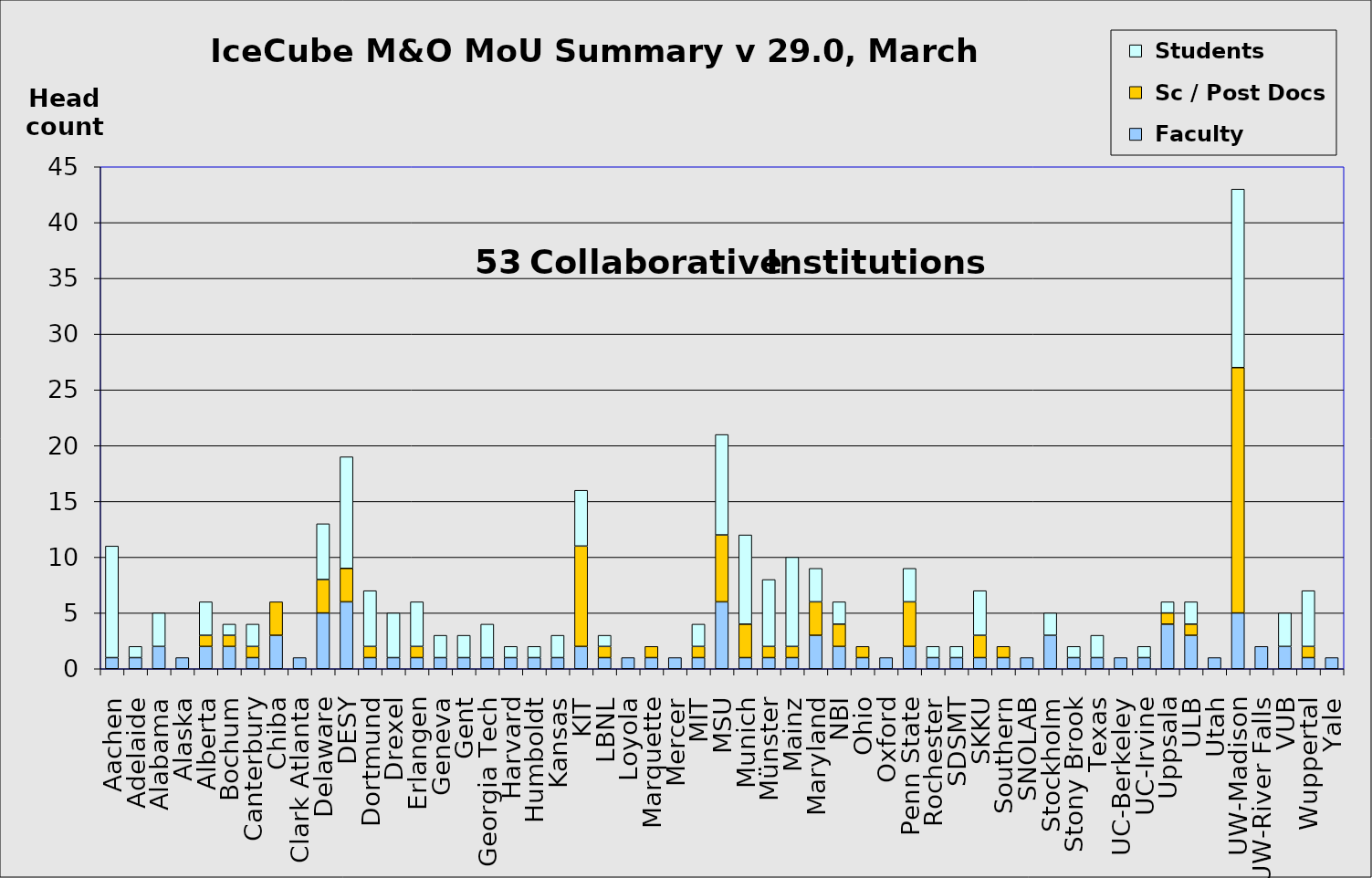
| Category |  Faculty |  Sc / Post Docs |  Students |
|---|---|---|---|
| Aachen | 1 | 0 | 10 |
| Adelaide | 1 | 0 | 1 |
| Alabama | 2 | 0 | 3 |
| Alaska | 1 | 0 | 0 |
| Alberta | 2 | 1 | 3 |
| Bochum | 2 | 1 | 1 |
| Canterbury | 1 | 1 | 2 |
| Chiba | 3 | 3 | 0 |
| Clark Atlanta | 1 | 0 | 0 |
| Delaware | 5 | 3 | 5 |
| DESY | 6 | 3 | 10 |
| Dortmund | 1 | 1 | 5 |
| Drexel | 1 | 0 | 4 |
| Erlangen | 1 | 1 | 4 |
| Geneva | 1 | 0 | 2 |
| Gent | 1 | 0 | 2 |
| Georgia Tech | 1 | 0 | 3 |
| Harvard | 1 | 0 | 1 |
| Humboldt | 1 | 0 | 1 |
| Kansas | 1 | 0 | 2 |
| KIT | 2 | 9 | 5 |
| LBNL | 1 | 1 | 1 |
| Loyola | 1 | 0 | 0 |
| Marquette | 1 | 1 | 0 |
| Mercer | 1 | 0 | 0 |
| MIT | 1 | 1 | 2 |
| MSU | 6 | 6 | 9 |
| Munich | 1 | 3 | 8 |
| Münster | 1 | 1 | 6 |
| Mainz | 1 | 1 | 8 |
| Maryland | 3 | 3 | 3 |
| NBI | 2 | 2 | 2 |
| Ohio | 1 | 1 | 0 |
| Oxford | 1 | 0 | 0 |
| Penn State | 2 | 4 | 3 |
| Rochester | 1 | 0 | 1 |
| SDSMT | 1 | 0 | 1 |
| SKKU | 1 | 2 | 4 |
| Southern | 1 | 1 | 0 |
| SNOLAB | 1 | 0 | 0 |
| Stockholm | 3 | 0 | 2 |
| Stony Brook | 1 | 0 | 1 |
| Texas | 1 | 0 | 2 |
| UC-Berkeley | 1 | 0 | 0 |
| UC-Irvine | 1 | 0 | 1 |
| Uppsala | 4 | 1 | 1 |
| ULB | 3 | 1 | 2 |
| Utah | 1 | 0 | 0 |
| UW-Madison | 5 | 22 | 16 |
| UW-River Falls | 2 | 0 | 0 |
| VUB | 2 | 0 | 3 |
| Wuppertal | 1 | 1 | 5 |
| Yale | 1 | 0 | 0 |